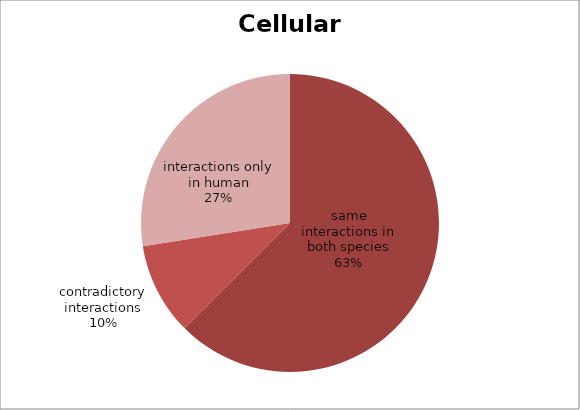
| Category | Series 0 |
|---|---|
| same interactions in both species | 25 |
| contradictory interactions | 4 |
| interactions only in human | 11 |